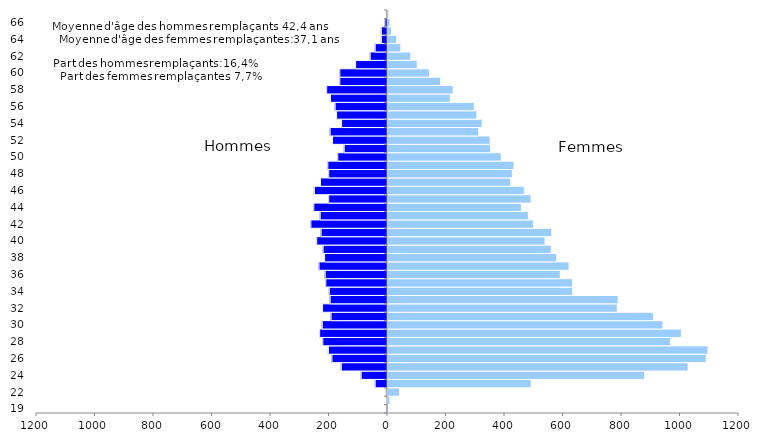
| Category | Hommes | Femmes |
|---|---|---|
| 19.0 | -1 | 0 |
| 21.0 | 0 | 7 |
| 22.0 | -4 | 40 |
| 23.0 | -42 | 489 |
| 24.0 | -90 | 877 |
| 25.0 | -158 | 1026 |
| 26.0 | -190 | 1088 |
| 27.0 | -202 | 1094 |
| 28.0 | -221 | 966 |
| 29.0 | -232 | 1003 |
| 30.0 | -223 | 940 |
| 31.0 | -193 | 908 |
| 32.0 | -222 | 784 |
| 33.0 | -196 | 787 |
| 34.0 | -199 | 631 |
| 35.0 | -211 | 631 |
| 36.0 | -213 | 589 |
| 37.0 | -234 | 619 |
| 38.0 | -215 | 576 |
| 39.0 | -220 | 558 |
| 40.0 | -242 | 537 |
| 41.0 | -227 | 560 |
| 42.0 | -262 | 498 |
| 43.0 | -230 | 480 |
| 44.0 | -252 | 456 |
| 45.0 | -201 | 489 |
| 46.0 | -250 | 466 |
| 47.0 | -229 | 419 |
| 48.0 | -201 | 425 |
| 49.0 | -204 | 431 |
| 50.0 | -170 | 387 |
| 51.0 | -148 | 351 |
| 52.0 | -188 | 349 |
| 53.0 | -196 | 310 |
| 54.0 | -157 | 322 |
| 55.0 | -174 | 304 |
| 56.0 | -179 | 295 |
| 57.0 | -195 | 213 |
| 58.0 | -208 | 223 |
| 59.0 | -163 | 180 |
| 60.0 | -163 | 142 |
| 61.0 | -109 | 100 |
| 62.0 | -59 | 78 |
| 63.0 | -42 | 44 |
| 64.0 | -21 | 30 |
| 65.0 | -21 | 12 |
| 66.0 | -9 | 7 |
| 67.0 | -1 | 3 |